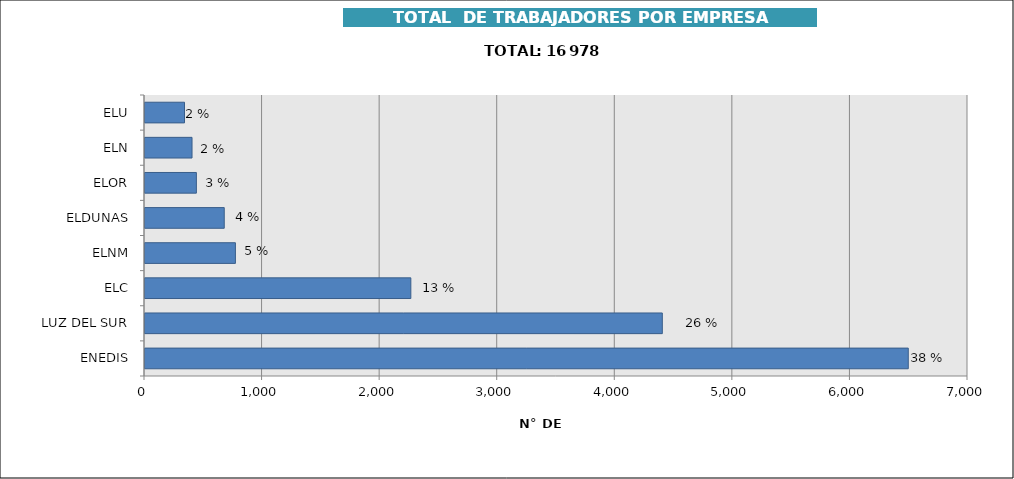
| Category | Series 0 |
|---|---|
| ENEDIS | 6492 |
| LUZ DEL SUR | 4400 |
| ELC | 2261 |
| ELNM | 769 |
| ELDUNAS | 674 |
| ELOR | 437 |
| ELN | 400 |
| ELU | 336 |